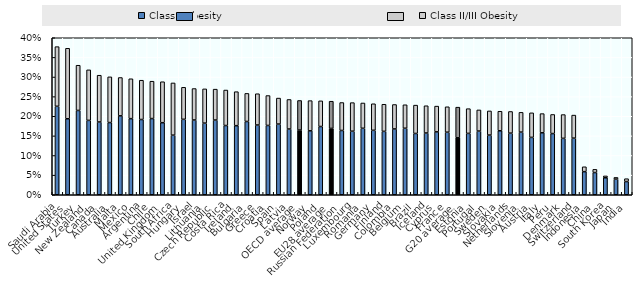
| Category | Class I Obesity | Class II/III Obesity |
|---|---|---|
| Saudi Arabia | 0.225 | 0.152 |
| United States | 0.194 | 0.18 |
| Turkey | 0.215 | 0.115 |
| New Zealand | 0.19 | 0.129 |
| Canada | 0.185 | 0.119 |
| Australia | 0.184 | 0.116 |
| Malta | 0.201 | 0.098 |
| Mexico | 0.194 | 0.102 |
| Argentina | 0.192 | 0.1 |
| Chile | 0.194 | 0.095 |
| United Kingdom | 0.184 | 0.104 |
| South Africa | 0.152 | 0.133 |
| Hungary | 0.192 | 0.082 |
| Israel | 0.191 | 0.08 |
| Lithuania | 0.183 | 0.087 |
| Czech Republic | 0.19 | 0.079 |
| Costa Rica | 0.176 | 0.09 |
| Ireland | 0.176 | 0.087 |
| Bulgaria | 0.187 | 0.072 |
| Greece | 0.178 | 0.08 |
| Croatia | 0.177 | 0.076 |
| Spain | 0.18 | 0.066 |
| Latvia | 0.167 | 0.075 |
| OECD average | 0.165 | 0.075 |
| Norway | 0.163 | 0.077 |
| Poland | 0.174 | 0.065 |
| EU28 average | 0.169 | 0.069 |
| Russian Federation | 0.164 | 0.071 |
| Luxembourg | 0.162 | 0.073 |
| Romania | 0.169 | 0.064 |
| Germany | 0.164 | 0.068 |
| Finland | 0.162 | 0.069 |
| Colombia | 0.168 | 0.062 |
| Belgium | 0.169 | 0.06 |
| Brazil | 0.156 | 0.072 |
| Iceland | 0.157 | 0.069 |
| Cyprus | 0.16 | 0.066 |
| France | 0.159 | 0.065 |
| G20 average | 0.145 | 0.078 |
| Estonia | 0.156 | 0.063 |
| Portugal | 0.162 | 0.054 |
| Sweden | 0.152 | 0.062 |
| Slovakia | 0.163 | 0.05 |
| Netherlands | 0.157 | 0.055 |
| Slovenia | 0.16 | 0.05 |
| Austria | 0.146 | 0.063 |
| Italy | 0.158 | 0.049 |
| Peru | 0.156 | 0.049 |
| Denmark | 0.144 | 0.061 |
| Switzerland | 0.144 | 0.059 |
| Indonesia | 0.059 | 0.012 |
| China | 0.057 | 0.008 |
| South Korea | 0.043 | 0.005 |
| Japan | 0.04 | 0.004 |
| India | 0.034 | 0.007 |